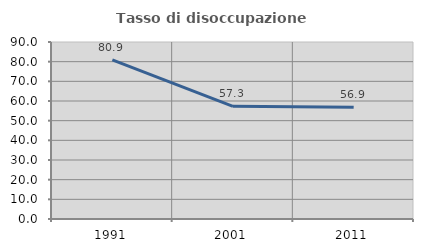
| Category | Tasso di disoccupazione giovanile  |
|---|---|
| 1991.0 | 80.909 |
| 2001.0 | 57.292 |
| 2011.0 | 56.872 |